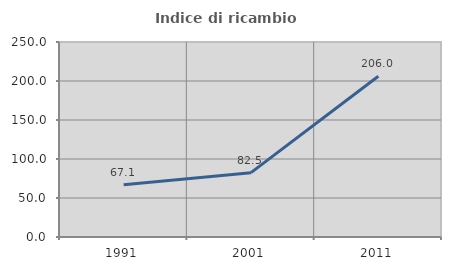
| Category | Indice di ricambio occupazionale  |
|---|---|
| 1991.0 | 67.073 |
| 2001.0 | 82.517 |
| 2011.0 | 206.024 |